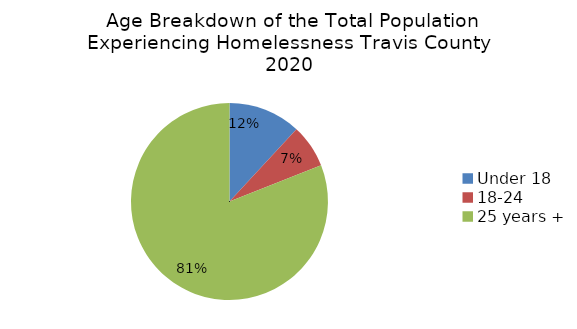
| Category | Percent of Total |
|---|---|
| Under 18 | 0.119 |
| 18-24 | 0.071 |
| 25 years + | 0.81 |